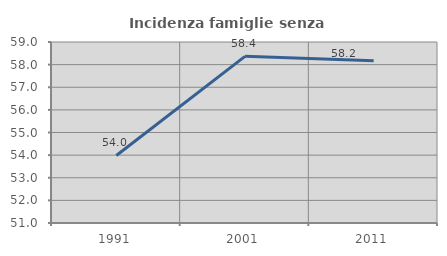
| Category | Incidenza famiglie senza nuclei |
|---|---|
| 1991.0 | 53.986 |
| 2001.0 | 58.367 |
| 2011.0 | 58.168 |